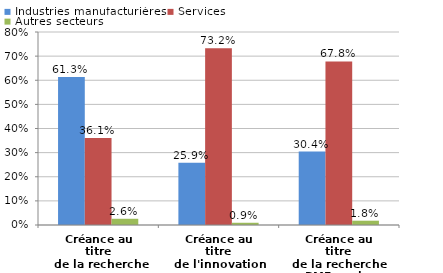
| Category | Industries manufacturières | Services | Autres secteurs |
|---|---|---|---|
| Créance au titre
 de la recherche | 0.613 | 0.361 | 0.026 |
| Créance au titre
de l'innovation | 0.259 | 0.732 | 0.009 |
| Créance au titre
de la recherche
PME seules | 0.304 | 0.678 | 0.018 |